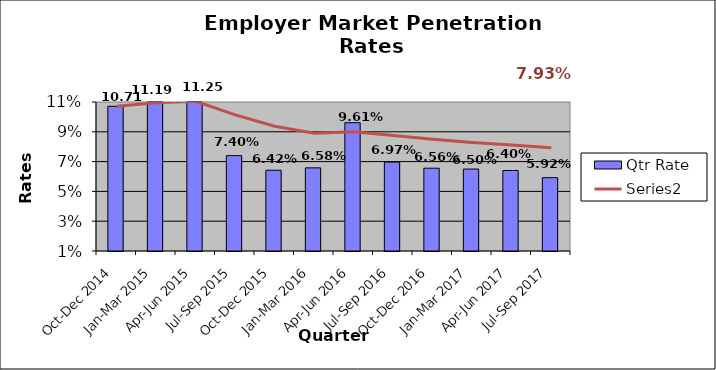
| Category | Qtr Rate |
|---|---|
| Oct-Dec 2014 | 0.107 |
| Jan-Mar 2015 | 0.112 |
| Apr-Jun 2015 | 0.112 |
| Jul-Sep 2015 | 0.074 |
| Oct-Dec 2015 | 0.064 |
| Jan-Mar 2016 | 0.066 |
| Apr-Jun 2016 | 0.096 |
| Jul-Sep 2016 | 0.07 |
| Oct-Dec 2016 | 0.066 |
| Jan-Mar 2017 | 0.065 |
| Apr-Jun 2017 | 0.064 |
| Jul-Sep 2017 | 0.059 |